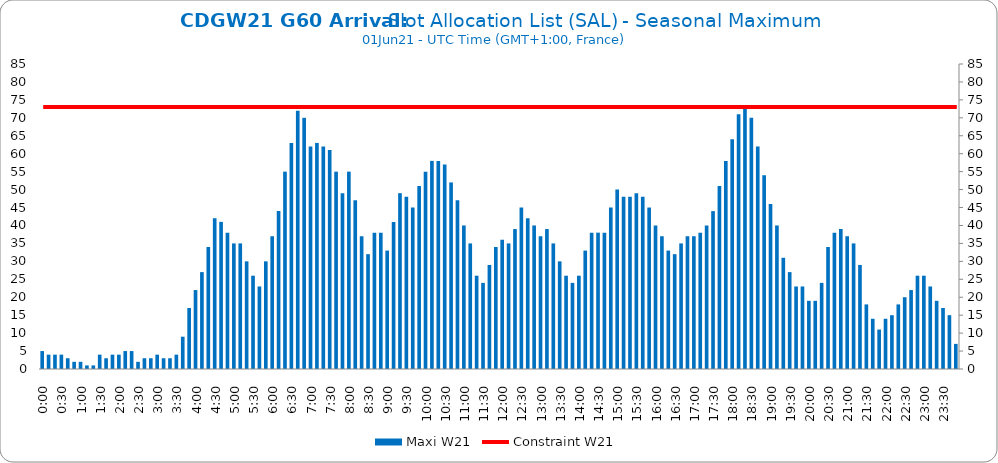
| Category | Maxi W21 |
|---|---|
| 0.0 | 5 |
| 0.006944444444444444 | 4 |
| 0.013888888888888888 | 4 |
| 0.020833333333333332 | 4 |
| 0.027777777777777776 | 3 |
| 0.034722222222222224 | 2 |
| 0.041666666666666664 | 2 |
| 0.04861111111111111 | 1 |
| 0.05555555555555555 | 1 |
| 0.0625 | 4 |
| 0.06944444444444443 | 3 |
| 0.0763888888888889 | 4 |
| 0.08333333333333333 | 4 |
| 0.09027777777777778 | 5 |
| 0.09722222222222222 | 5 |
| 0.10416666666666667 | 2 |
| 0.1111111111111111 | 3 |
| 0.11805555555555557 | 3 |
| 0.125 | 4 |
| 0.13194444444444445 | 3 |
| 0.1388888888888889 | 3 |
| 0.14583333333333334 | 4 |
| 0.15277777777777776 | 9 |
| 0.15972222222222224 | 17 |
| 0.16666666666666666 | 22 |
| 0.17361111111111113 | 27 |
| 0.18055555555555555 | 34 |
| 0.1875 | 42 |
| 0.19444444444444445 | 41 |
| 0.20138888888888887 | 38 |
| 0.20833333333333334 | 35 |
| 0.2152777777777778 | 35 |
| 0.2222222222222222 | 30 |
| 0.22916666666666666 | 26 |
| 0.23611111111111113 | 23 |
| 0.24305555555555555 | 30 |
| 0.25 | 37 |
| 0.2569444444444445 | 44 |
| 0.2638888888888889 | 55 |
| 0.2708333333333333 | 63 |
| 0.2777777777777778 | 72 |
| 0.2847222222222222 | 70 |
| 0.2916666666666667 | 62 |
| 0.2986111111111111 | 63 |
| 0.3055555555555555 | 62 |
| 0.3125 | 61 |
| 0.3194444444444445 | 55 |
| 0.3263888888888889 | 49 |
| 0.3333333333333333 | 55 |
| 0.34027777777777773 | 47 |
| 0.34722222222222227 | 37 |
| 0.3541666666666667 | 32 |
| 0.3611111111111111 | 38 |
| 0.3680555555555556 | 38 |
| 0.375 | 33 |
| 0.3819444444444444 | 41 |
| 0.3888888888888889 | 49 |
| 0.3958333333333333 | 48 |
| 0.40277777777777773 | 45 |
| 0.40972222222222227 | 51 |
| 0.4166666666666667 | 55 |
| 0.4236111111111111 | 58 |
| 0.4305555555555556 | 58 |
| 0.4375 | 57 |
| 0.4444444444444444 | 52 |
| 0.4513888888888889 | 47 |
| 0.4583333333333333 | 40 |
| 0.46527777777777773 | 35 |
| 0.47222222222222227 | 26 |
| 0.4791666666666667 | 24 |
| 0.4861111111111111 | 29 |
| 0.4930555555555556 | 34 |
| 0.5 | 36 |
| 0.5069444444444444 | 35 |
| 0.513888888888889 | 39 |
| 0.5208333333333334 | 45 |
| 0.5277777777777778 | 42 |
| 0.5347222222222222 | 40 |
| 0.5416666666666666 | 37 |
| 0.548611111111111 | 39 |
| 0.5555555555555556 | 35 |
| 0.5625 | 30 |
| 0.5694444444444444 | 26 |
| 0.576388888888889 | 24 |
| 0.5833333333333334 | 26 |
| 0.5902777777777778 | 33 |
| 0.5972222222222222 | 38 |
| 0.6041666666666666 | 38 |
| 0.611111111111111 | 38 |
| 0.6180555555555556 | 45 |
| 0.625 | 50 |
| 0.6319444444444444 | 48 |
| 0.638888888888889 | 48 |
| 0.6458333333333334 | 49 |
| 0.6527777777777778 | 48 |
| 0.6597222222222222 | 45 |
| 0.6666666666666666 | 40 |
| 0.6736111111111112 | 37 |
| 0.6805555555555555 | 33 |
| 0.6875 | 32 |
| 0.6944444444444445 | 35 |
| 0.7013888888888888 | 37 |
| 0.7083333333333334 | 37 |
| 0.7152777777777778 | 38 |
| 0.7222222222222222 | 40 |
| 0.7291666666666666 | 44 |
| 0.7361111111111112 | 51 |
| 0.7430555555555555 | 58 |
| 0.75 | 64 |
| 0.7569444444444445 | 71 |
| 0.7638888888888888 | 73 |
| 0.7708333333333334 | 70 |
| 0.7777777777777778 | 62 |
| 0.7847222222222222 | 54 |
| 0.7916666666666666 | 46 |
| 0.7986111111111112 | 40 |
| 0.8055555555555555 | 31 |
| 0.8125 | 27 |
| 0.8194444444444445 | 23 |
| 0.8263888888888888 | 23 |
| 0.8333333333333334 | 19 |
| 0.8402777777777778 | 19 |
| 0.8472222222222222 | 24 |
| 0.8541666666666666 | 34 |
| 0.8611111111111112 | 38 |
| 0.8680555555555555 | 39 |
| 0.875 | 37 |
| 0.8819444444444445 | 35 |
| 0.8888888888888888 | 29 |
| 0.8958333333333334 | 18 |
| 0.9027777777777778 | 14 |
| 0.9097222222222222 | 11 |
| 0.9166666666666666 | 14 |
| 0.9236111111111112 | 15 |
| 0.9305555555555555 | 18 |
| 0.9375 | 20 |
| 0.9444444444444445 | 22 |
| 0.9513888888888888 | 26 |
| 0.9583333333333334 | 26 |
| 0.9652777777777778 | 23 |
| 0.9722222222222222 | 19 |
| 0.9791666666666666 | 17 |
| 0.9861111111111112 | 15 |
| 0.9930555555555555 | 7 |